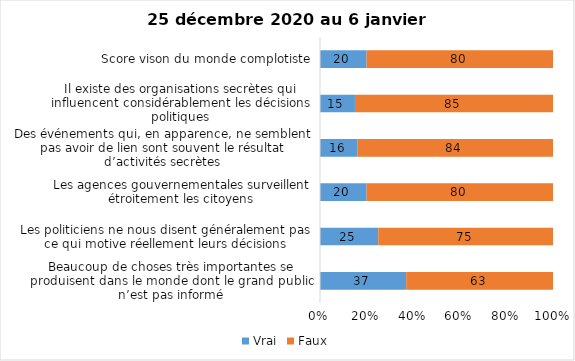
| Category | Vrai | Faux |
|---|---|---|
| Beaucoup de choses très importantes se produisent dans le monde dont le grand public n’est pas informé | 37 | 63 |
| Les politiciens ne nous disent généralement pas ce qui motive réellement leurs décisions | 25 | 75 |
| Les agences gouvernementales surveillent étroitement les citoyens | 20 | 80 |
| Des événements qui, en apparence, ne semblent pas avoir de lien sont souvent le résultat d’activités secrètes | 16 | 84 |
| Il existe des organisations secrètes qui influencent considérablement les décisions politiques | 15 | 85 |
| Score vison du monde complotiste | 20 | 80 |